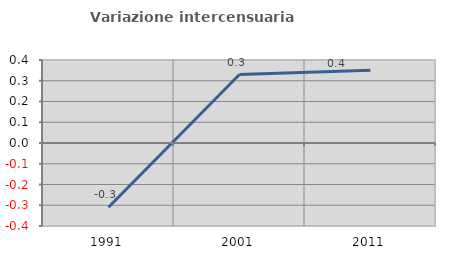
| Category | Variazione intercensuaria annua |
|---|---|
| 1991.0 | -0.31 |
| 2001.0 | 0.33 |
| 2011.0 | 0.35 |